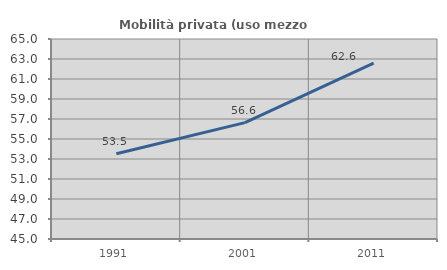
| Category | Mobilità privata (uso mezzo privato) |
|---|---|
| 1991.0 | 53.524 |
| 2001.0 | 56.636 |
| 2011.0 | 62.579 |